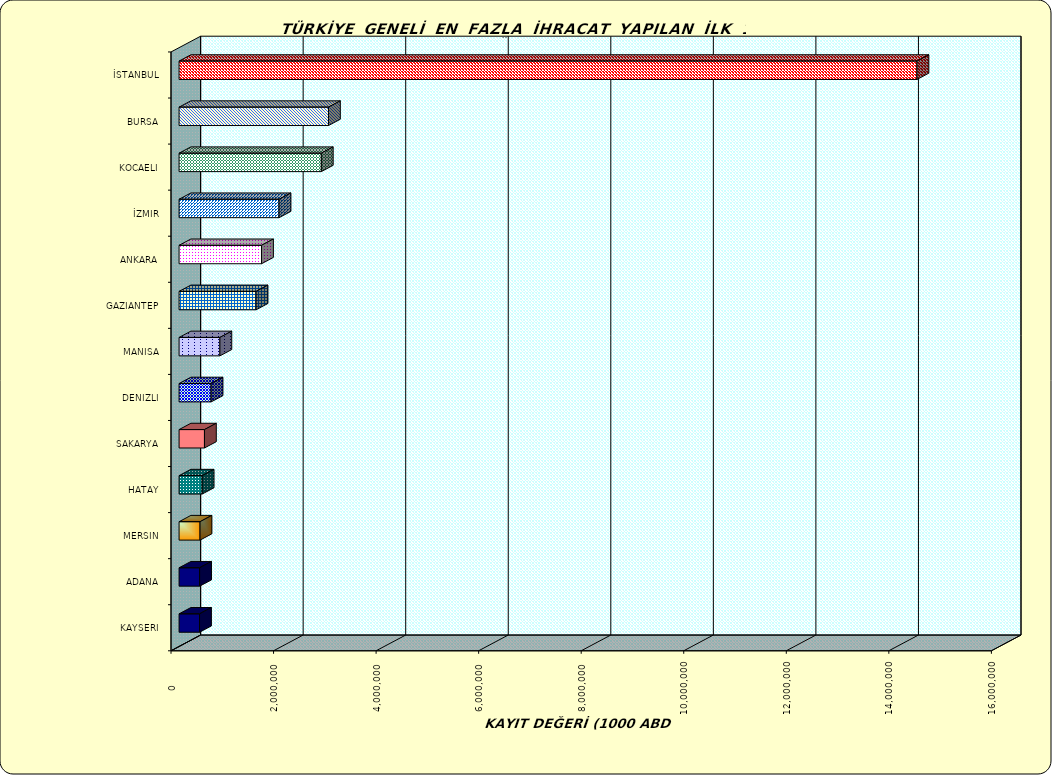
| Category | Series 0 |
|---|---|
| İSTANBUL | 14391105.171 |
| BURSA | 2914145.993 |
| KOCAELI | 2774009.365 |
| İZMIR | 1950253.607 |
| ANKARA | 1608361.052 |
| GAZIANTEP | 1501734.071 |
| MANISA | 796143.966 |
| DENIZLI | 624187.954 |
| SAKARYA | 494977.706 |
| HATAY | 450448.116 |
| MERSIN | 408820.482 |
| ADANA | 400956.331 |
| KAYSERI | 399087.269 |